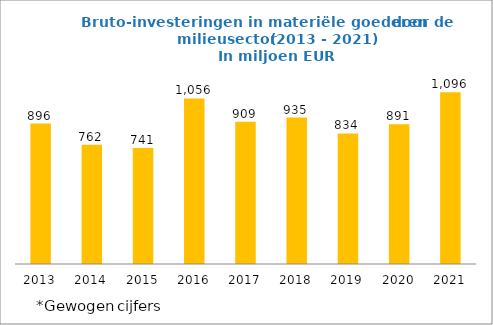
| Category | Bruto-investeringen in materiële goederen |
|---|---|
| 2013.0 | 896.197 |
| 2014.0 | 761.593 |
| 2015.0 | 741.069 |
| 2016.0 | 1056.442 |
| 2017.0 | 908.55 |
| 2018.0 | 934.545 |
| 2019.0 | 833.717 |
| 2020.0 | 891.356 |
| 2021.0 | 1096.489 |